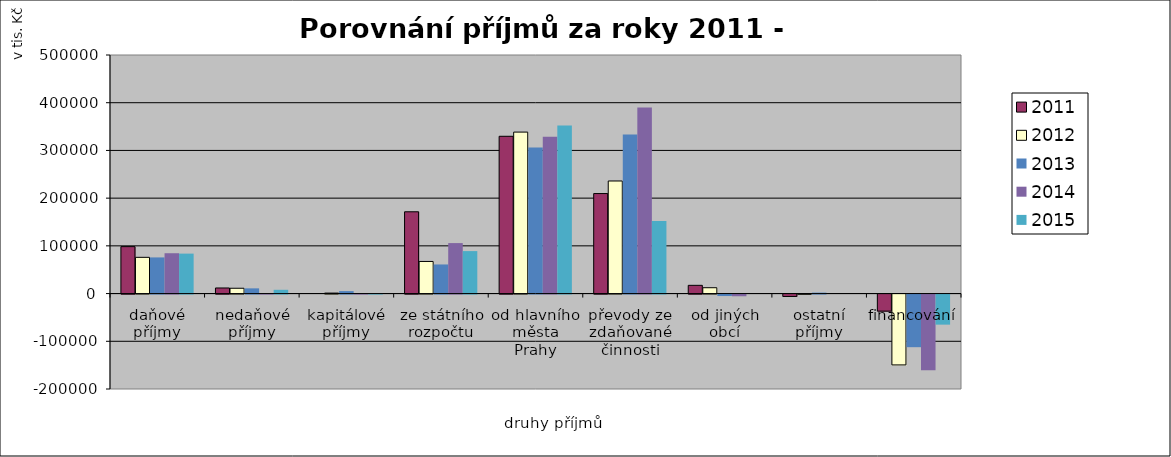
| Category | 2011 | 2012 | 2013 | 2014 | 2015 |
|---|---|---|---|---|---|
| daňové příjmy | 98372 | 75958.2 | 75770 | 84567.1 | 83735.9 |
| nedaňové příjmy | 11715.6 | 11135.7 | 10930 | 413.5 | 7934.9 |
| kapitálové příjmy | 0 | 1000 | 5156.1 | 350 | 400 |
| ze státního rozpočtu | 171405 | 67292 | 61009.4 | 105803.2 | 89018.7 |
| od hlavního města Prahy | 329646.9 | 338399.6 | 306214.4 | 328860.1 | 352272.5 |
| převody ze zdaňované činnosti | 209631.7 | 235934.5 | 333599.6 | 390018.4 | 152255.2 |
| od jiných obcí | 17254.3 | 12250 | -3072.5 | -3510.4 | 0 |
| ostatní příjmy | -5000 | -538.4 | 2003.1 | 0 | 0 |
| financování | -35748.8 | -148475 | -110266 | -158651.1 | -63027.8 |